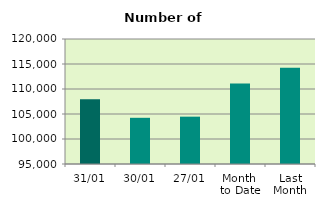
| Category | Series 0 |
|---|---|
| 31/01 | 107956 |
| 30/01 | 104240 |
| 27/01 | 104468 |
| Month 
to Date | 111077.545 |
| Last
Month | 114251.429 |